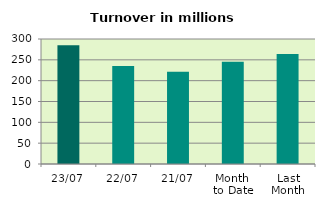
| Category | Series 0 |
|---|---|
| 23/07 | 284.913 |
| 22/07 | 235.23 |
| 21/07 | 221.648 |
| Month 
to Date | 245.219 |
| Last
Month | 264.074 |